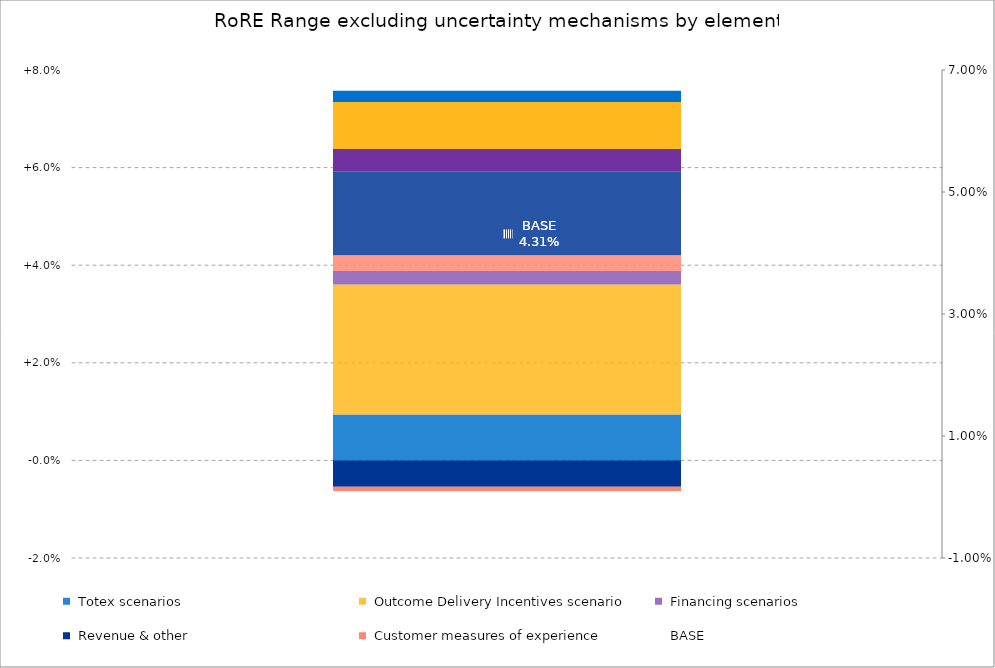
| Category |  Minimum  |  Totex scenarios  |  Outcome Delivery Incentives scenario  |  Financing scenarios  |  Customer measures of experience  |  Revenue & other  | Series 21 | Series 22 | Series 23 | Series 24 | Series 25 | Series 26 | Series 27 | Series 28 |
|---|---|---|---|---|---|---|---|---|---|---|---|---|---|---|
| RoRE Base case | 0 | 0.002 | 0.01 | 0.005 | -0.001 | -0.005 |  |  |  |  |  |  |  |  |